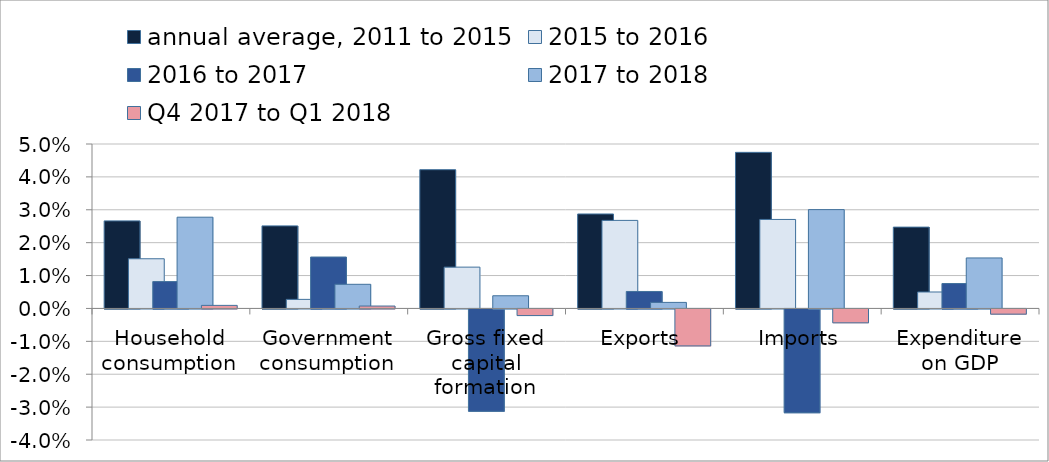
| Category | annual average, 2011 to 2015 | 2015 to 2016 | 2016 to 2017 | 2017 to 2018 | Q4 2017 to Q1 2018 |
|---|---|---|---|---|---|
| Household consumption | 0.027 | 0.015 | 0.008 | 0.028 | 0.001 |
| Government consumption | 0.025 | 0.003 | 0.016 | 0.007 | 0.001 |
| Gross fixed capital formation | 0.042 | 0.013 | -0.031 | 0.004 | -0.002 |
| Exports | 0.029 | 0.027 | 0.005 | 0.002 | -0.011 |
| Imports | 0.047 | 0.027 | -0.032 | 0.03 | -0.004 |
| Expenditure on GDP | 0.025 | 0.005 | 0.008 | 0.015 | -0.002 |